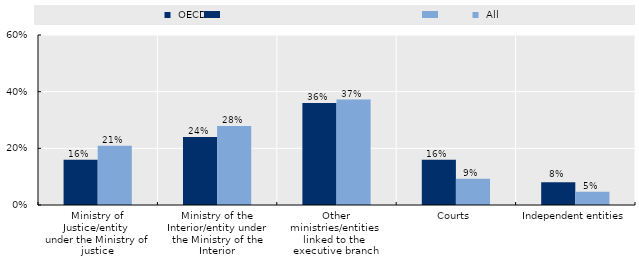
| Category |  OECD |  All |
|---|---|---|
| Ministry of Justice/entity 
under the Ministry of justice | 0.16 | 0.209 |
| Ministry of the Interior/entity under the Ministry of the Interior | 0.24 | 0.279 |
| Other ministries/entities 
linked to the 
executive branch | 0.36 | 0.372 |
| Courts | 0.16 | 0.093 |
| Independent entities | 0.08 | 0.047 |